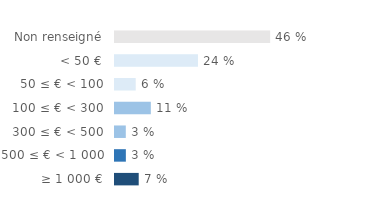
| Category | Series 0 |
|---|---|
| Non renseigné | 0.456 |
| < 50 € | 0.244 |
| 50 ≤ € < 100 | 0.061 |
| 100 ≤ € < 300 | 0.105 |
| 300 ≤ € < 500 | 0.032 |
| 500 ≤ € < 1 000 | 0.032 |
| ≥ 1 000 € | 0.07 |